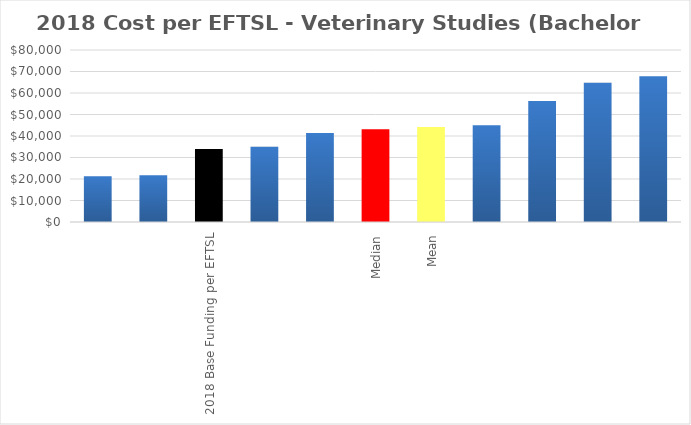
| Category | Series 0 |
|---|---|
|  | 21221.399 |
|  | 21765.211 |
| 2018 Base Funding per EFTSL | 33905 |
|  | 34964.807 |
|  | 41348.637 |
| Median | 43169.167 |
| Mean | 44142.047 |